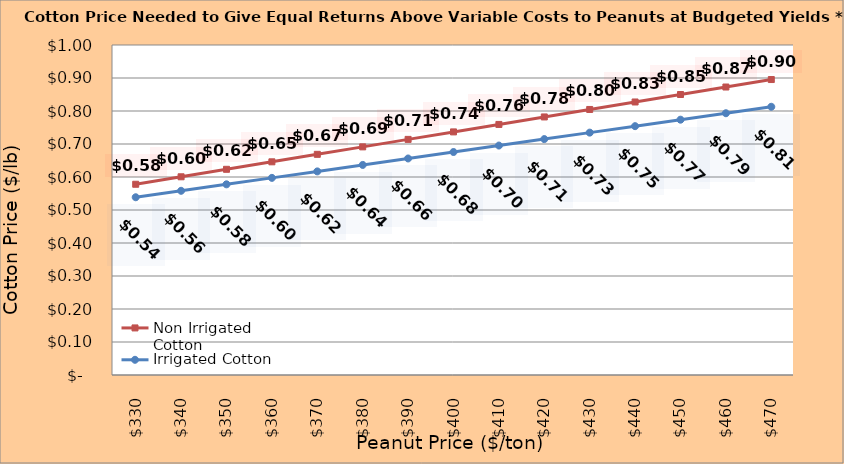
| Category | Non Irrigated Cotton | Irrigated Cotton |
|---|---|---|
| 330.0 | 0.578 | 0.539 |
| 340.0 | 0.601 | 0.558 |
| 350.0 | 0.623 | 0.578 |
| 360.0 | 0.646 | 0.597 |
| 370.0 | 0.669 | 0.617 |
| 380.0 | 0.691 | 0.637 |
| 390.0 | 0.714 | 0.656 |
| 400.0 | 0.737 | 0.676 |
| 410.0 | 0.759 | 0.695 |
| 420.0 | 0.782 | 0.715 |
| 430.0 | 0.805 | 0.734 |
| 440.0 | 0.827 | 0.754 |
| 450.0 | 0.85 | 0.774 |
| 460.0 | 0.873 | 0.793 |
| 470.0 | 0.895 | 0.813 |